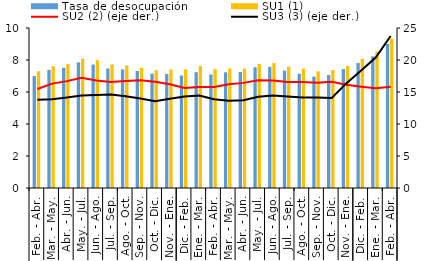
| Category | Tasa de desocupación | SU1 (1) |
|---|---|---|
| 0 | 6.994 | 7.3 |
| 1 | 7.381 | 7.608 |
| 2 | 7.514 | 7.738 |
| 3 | 7.853 | 8.076 |
| 4 | 7.719 | 7.983 |
| 5 | 7.47 | 7.718 |
| 6 | 7.412 | 7.657 |
| 7 | 7.311 | 7.513 |
| 8 | 7.146 | 7.363 |
| 9 | 7.13 | 7.408 |
| 10 | 7.034 | 7.407 |
| 11 | 7.236 | 7.622 |
| 12 | 7.096 | 7.429 |
| 13 | 7.232 | 7.47 |
| 14 | 7.254 | 7.464 |
| 15 | 7.549 | 7.754 |
| 16 | 7.572 | 7.807 |
| 17 | 7.337 | 7.588 |
| 18 | 7.141 | 7.465 |
| 19 | 6.96 | 7.291 |
| 20 | 7.063 | 7.377 |
| 21 | 7.433 | 7.63 |
| 22 | 7.811 | 8.073 |
| 23 | 8.229 | 8.531 |
| 24 | 9.002 | 9.331 |